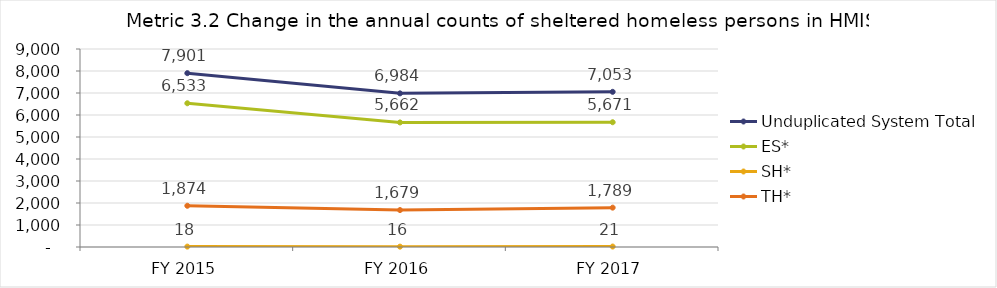
| Category | Unduplicated System Total | ES* | SH* | TH* |
|---|---|---|---|---|
| FY 2015 | 7901 | 6533 | 18 | 1874 |
| FY 2016 | 6984 | 5662 | 16 | 1679 |
| FY 2017 | 7053 | 5671 | 21 | 1789 |